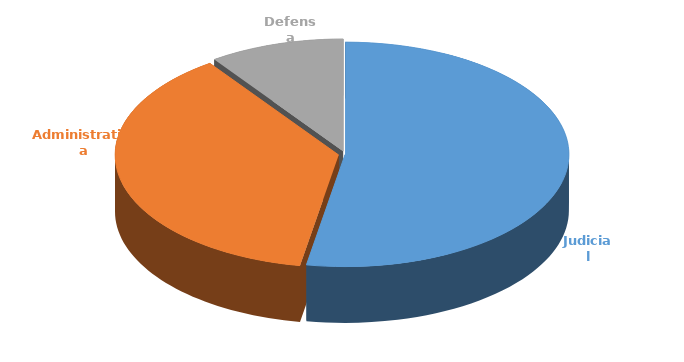
| Category | Cantidad |
|---|---|
| Judicial | 324 |
| Administrativa | 230 |
| Defensa | 60 |